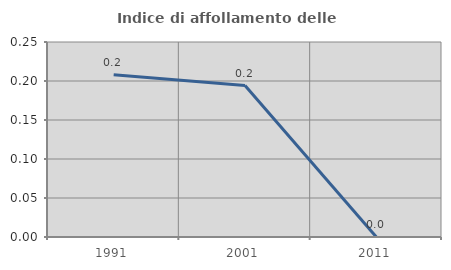
| Category | Indice di affollamento delle abitazioni  |
|---|---|
| 1991.0 | 0.208 |
| 2001.0 | 0.194 |
| 2011.0 | 0 |